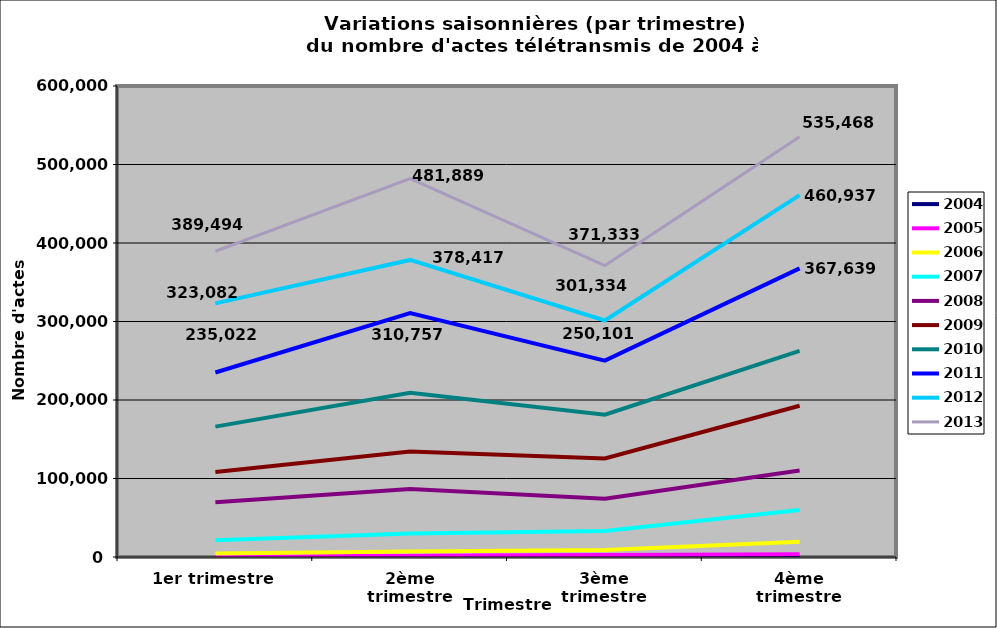
| Category | 2004 | 2005 | 2006 | 2007 | 2008 | 2009 | 2010 | 2011 | 2012 | 2013 |
|---|---|---|---|---|---|---|---|---|---|---|
| 1er trimestre | 22 | 324 | 4334 | 21337 | 69629 | 108357 | 166072 | 235022 | 323082 | 389494 |
| 2ème trimestre | 1 | 1552 | 7105 | 29985 | 86475 | 134526 | 209207 | 310757 | 378417 | 481889 |
| 3ème trimestre | 0 | 2393 | 8999 | 33033 | 74156 | 125631 | 181314 | 250101 | 301334 | 371333 |
| 4ème trimestre | 54 | 3391 | 19515 | 59957 | 110286 | 192635 | 262476 | 367639 | 460937 | 535468 |